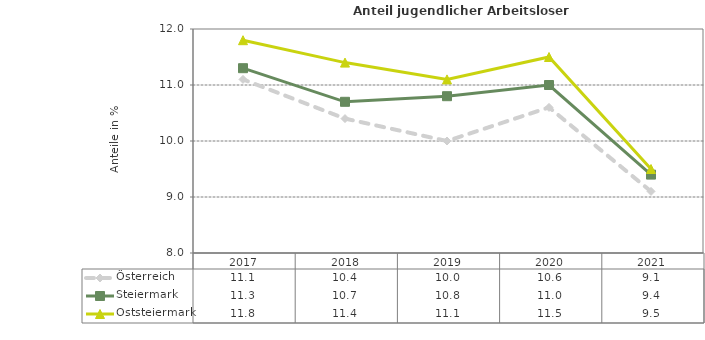
| Category | Österreich | Steiermark | Oststeiermark |
|---|---|---|---|
| 2021.0 | 9.1 | 9.4 | 9.5 |
| 2020.0 | 10.6 | 11 | 11.5 |
| 2019.0 | 10 | 10.8 | 11.1 |
| 2018.0 | 10.4 | 10.7 | 11.4 |
| 2017.0 | 11.1 | 11.3 | 11.8 |